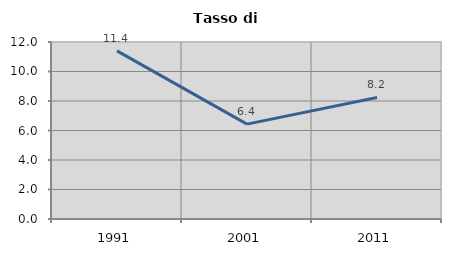
| Category | Tasso di disoccupazione   |
|---|---|
| 1991.0 | 11.398 |
| 2001.0 | 6.434 |
| 2011.0 | 8.242 |